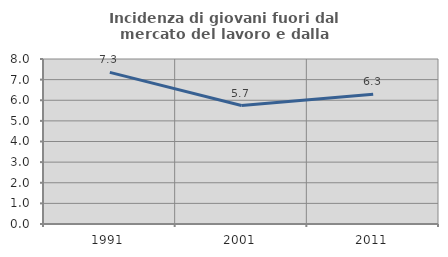
| Category | Incidenza di giovani fuori dal mercato del lavoro e dalla formazione  |
|---|---|
| 1991.0 | 7.35 |
| 2001.0 | 5.745 |
| 2011.0 | 6.293 |